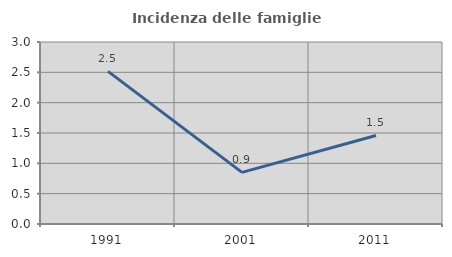
| Category | Incidenza delle famiglie numerose |
|---|---|
| 1991.0 | 2.517 |
| 2001.0 | 0.851 |
| 2011.0 | 1.459 |